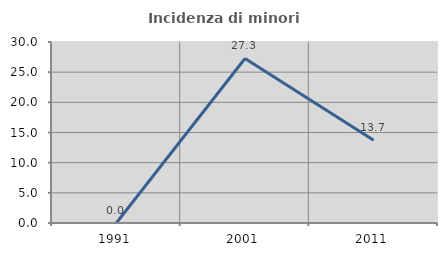
| Category | Incidenza di minori stranieri |
|---|---|
| 1991.0 | 0 |
| 2001.0 | 27.273 |
| 2011.0 | 13.699 |